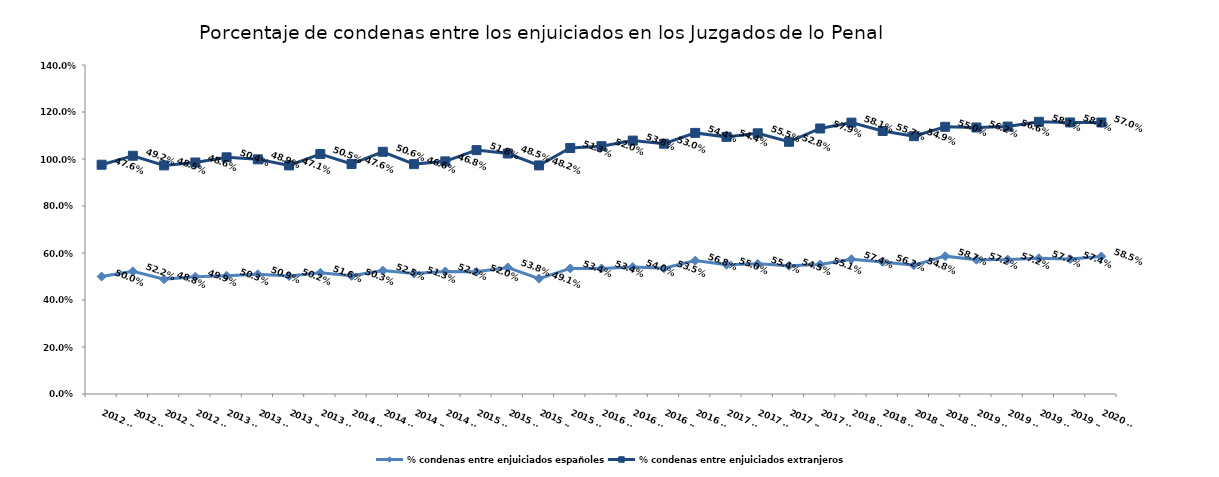
| Category | % condenas entre enjuiciados españoles | % condenas entre enjuiciados extranjeros |
|---|---|---|
| 2012 T1 | 0.5 | 0.476 |
| 2012 T2 | 0.522 | 0.492 |
| 2012 T3 | 0.488 | 0.485 |
| 2012 T4 | 0.499 | 0.486 |
| 2013 T1 | 0.503 | 0.504 |
| 2013 T2 | 0.509 | 0.489 |
| 2013 T3 | 0.502 | 0.471 |
| 2013 T4 | 0.516 | 0.505 |
| 2014 T1 | 0.503 | 0.476 |
| 2014 T2 | 0.525 | 0.506 |
| 2014 T3 | 0.513 | 0.466 |
| 2014 T4 | 0.522 | 0.468 |
| 2015 T1 | 0.52 | 0.518 |
| 2015 T2 | 0.538 | 0.485 |
| 2015 T3 | 0.491 | 0.482 |
| 2015 T4 | 0.534 | 0.513 |
| 2016 T1 | 0.534 | 0.52 |
| 2016 T2 | 0.54 | 0.538 |
| 2016 T3 | 0.535 | 0.53 |
| 2016 T4 | 0.568 | 0.544 |
| 2017 T1 | 0.55 | 0.544 |
| 2017 T2 | 0.554 | 0.555 |
| 2017 T3 | 0.545 | 0.528 |
| 2017 T4 | 0.551 | 0.579 |
| 2018 T1 | 0.574 | 0.581 |
| 2018 T2 | 0.562 | 0.557 |
| 2018 T3 | 0.548 | 0.549 |
| 2018 T4 | 0.587 | 0.55 |
| 2019 T1 | 0.572 | 0.562 |
| 2019 T2 | 0.572 | 0.566 |
| 2019 T3 | 0.577 | 0.581 |
| 2019 T4 | 0.574 | 0.581 |
| 2020 T1 | 0.585 | 0.57 |